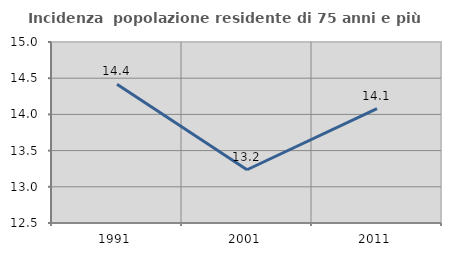
| Category | Incidenza  popolazione residente di 75 anni e più |
|---|---|
| 1991.0 | 14.418 |
| 2001.0 | 13.235 |
| 2011.0 | 14.079 |